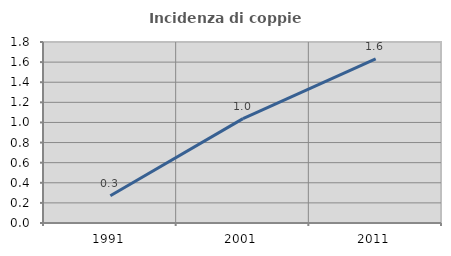
| Category | Incidenza di coppie miste |
|---|---|
| 1991.0 | 0.27 |
| 2001.0 | 1.038 |
| 2011.0 | 1.632 |